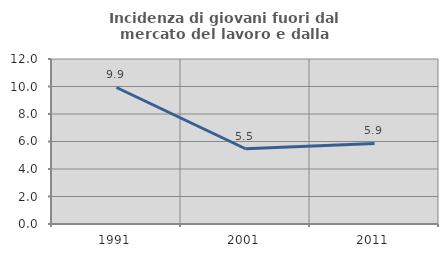
| Category | Incidenza di giovani fuori dal mercato del lavoro e dalla formazione  |
|---|---|
| 1991.0 | 9.928 |
| 2001.0 | 5.471 |
| 2011.0 | 5.857 |